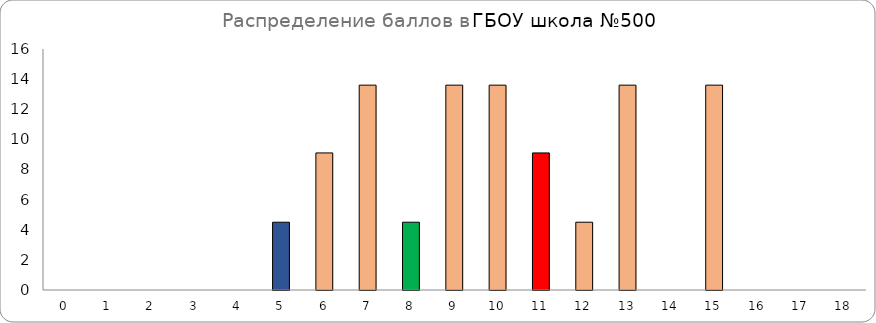
| Category | Series 0 |
|---|---|
| 0.0 | 0 |
| 1.0 | 0 |
| 2.0 | 0 |
| 3.0 | 0 |
| 4.0 | 0 |
| 5.0 | 4.5 |
| 6.0 | 9.1 |
| 7.0 | 13.6 |
| 8.0 | 4.5 |
| 9.0 | 13.6 |
| 10.0 | 13.6 |
| 11.0 | 9.1 |
| 12.0 | 4.5 |
| 13.0 | 13.6 |
| 14.0 | 0 |
| 15.0 | 13.6 |
| 16.0 | 0 |
| 17.0 | 0 |
| 18.0 | 0 |